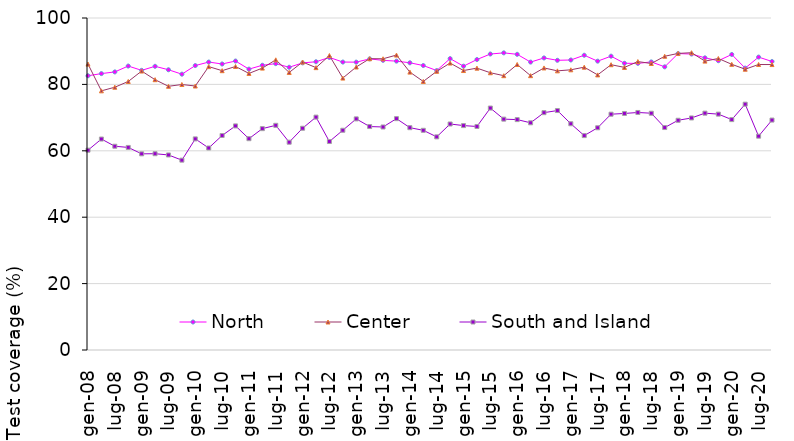
| Category | North | Center | South and Island |
|---|---|---|---|
| gen-08 | 82.601 | 86.108 | 60.186 |
| apr-08 | 83.251 | 78.061 | 63.543 |
| lug-08 | 83.759 | 79.153 | 61.375 |
| ott-08 | 85.53 | 80.879 | 61.016 |
| gen-09 | 84.231 | 84.018 | 59.086 |
| apr-09 | 85.451 | 81.421 | 59.123 |
| lug-09 | 84.409 | 79.433 | 58.745 |
| ott-09 | 83.08 | 79.969 | 57.186 |
| gen-10 | 85.671 | 79.518 | 63.586 |
| apr-10 | 86.731 | 85.361 | 60.843 |
| lug-10 | 86.149 | 84.133 | 64.605 |
| ott-10 | 87.04 | 85.399 | 67.496 |
| gen-11 | 84.601 | 83.308 | 63.646 |
| apr-11 | 85.761 | 84.911 | 66.673 |
| lug-11 | 86.249 | 87.403 | 67.675 |
| ott-11 | 85.16 | 83.599 | 62.586 |
| gen-12 | 86.481 | 86.738 | 66.796 |
| apr-12 | 86.821 | 85.051 | 70.143 |
| lug-12 | 88.119 | 88.693 | 62.795 |
| ott-12 | 86.73 | 81.909 | 66.186 |
| gen-13 | 86.701 | 85.248 | 69.616 |
| apr-13 | 87.681 | 87.741 | 67.303 |
| lug-13 | 87.239 | 87.723 | 67.175 |
| ott-13 | 87.01 | 88.829 | 69.686 |
| gen-14 | 86.511 | 83.698 | 66.966 |
| apr-14 | 85.681 | 80.891 | 66.173 |
| lug-14 | 84.169 | 83.943 | 64.195 |
| ott-14 | 87.77 | 86.429 | 68.076 |
| gen-15 | 85.491 | 84.178 | 67.596 |
| apr-15 | 87.491 | 84.901 | 67.323 |
| lug-15 | 89.149 | 83.513 | 72.875 |
| ott-15 | 89.5 | 82.629 | 69.536 |
| gen-16 | 89.061 | 85.998 | 69.396 |
| apr-16 | 86.721 | 82.631 | 68.433 |
| lug-16 | 87.969 | 84.963 | 71.485 |
| ott-16 | 87.26 | 84.079 | 72.126 |
| gen-17 | 87.351 | 84.398 | 68.146 |
| apr-17 | 88.781 | 85.191 | 64.583 |
| lug-17 | 86.999 | 82.863 | 66.935 |
| ott-17 | 88.5 | 85.929 | 71.026 |
| gen-18 | 86.361 | 85.128 | 71.246 |
| apr-18 | 86.331 | 86.871 | 71.543 |
| lug-18 | 86.779 | 86.293 | 71.315 |
| ott-18 | 85.29 | 88.479 | 67.006 |
| gen-19 | 89.291 | 89.328 | 69.196 |
| apr-19 | 89.141 | 89.551 | 69.893 |
| lug-19 | 87.999 | 87.013 | 71.335 |
| ott-19 | 87.13 | 87.809 | 71.046 |
| gen-20 | 89.011 | 86.048 | 69.396 |
| apr-20 | 84.901 | 84.581 | 74.043 |
| lug-20 | 88.229 | 85.993 | 64.405 |
| ott-20 | 86.9 | 85.979 | 69.256 |